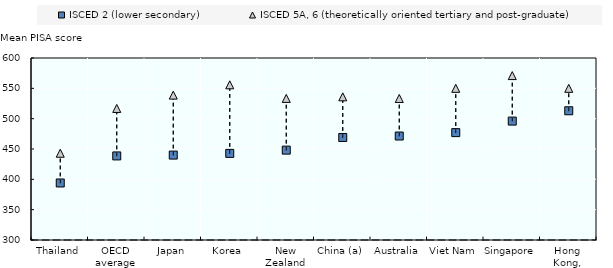
| Category | ISCED 2 (lower secondary) | ISCED 5A, 6 (theoretically oriented tertiary and post-graduate) |
|---|---|---|
| Thailand | 394 | 443 |
| OECD average | 438.582 | 516.848 |
| Japan | 439.964 | 538.825 |
| Korea | 442.778 | 555.826 |
| New Zealand | 448.132 | 533.378 |
| China (a) | 469 | 536 |
| Australia | 471.395 | 533.314 |
| Viet Nam | 477 | 550 |
| Singapore | 496 | 571 |
| Hong Kong, China | 513 | 550 |